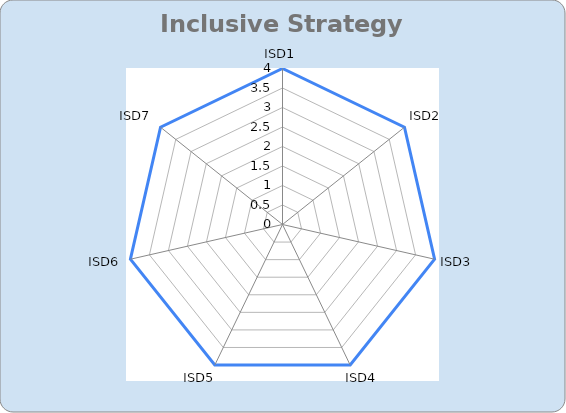
| Category | Series 0 |
|---|---|
| ISD1 | 4 |
| ISD2 | 4 |
| ISD3 | 4 |
| ISD4 | 4 |
| ISD5 | 4 |
| ISD6 | 4 |
| ISD7 | 4 |